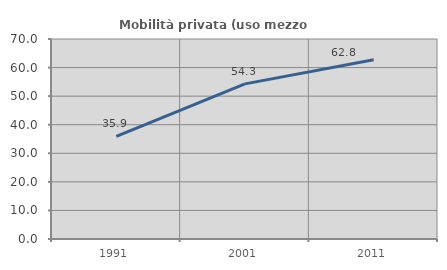
| Category | Mobilità privata (uso mezzo privato) |
|---|---|
| 1991.0 | 35.94 |
| 2001.0 | 54.302 |
| 2011.0 | 62.757 |